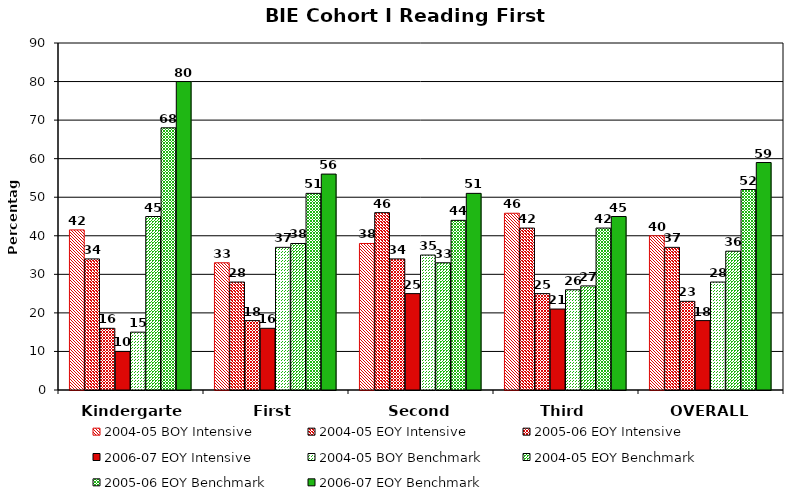
| Category | 2004-05 BOY Intensive | 2004-05 EOY Intensive | 2005-06 EOY Intensive | 2006-07 EOY Intensive | 2004-05 BOY Benchmark | 2004-05 EOY Benchmark | 2005-06 EOY Benchmark | 2006-07 EOY Benchmark |
|---|---|---|---|---|---|---|---|---|
| Kindergarten | 41.525 | 34 | 16 | 10 | 15 | 45 | 68 | 80 |
| First | 33 | 28 | 18 | 16 | 37 | 38 | 51 | 56 |
| Second | 38 | 46 | 34 | 25 | 35 | 33 | 44 | 51 |
| Third | 45.841 | 42 | 25 | 21 | 26 | 27 | 42 | 45 |
| OVERALL | 40 | 37 | 23 | 18 | 28 | 36 | 52 | 59 |